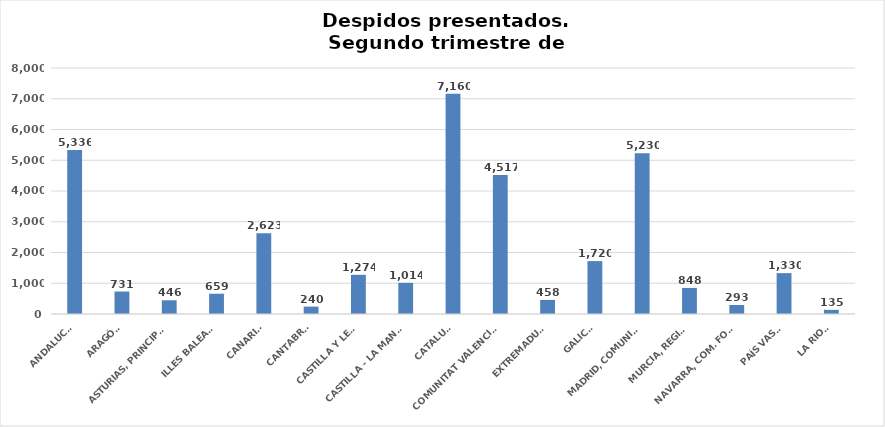
| Category | Series 0 |
|---|---|
| ANDALUCÍA | 5336 |
| ARAGÓN | 731 |
| ASTURIAS, PRINCIPADO | 446 |
| ILLES BALEARS | 659 |
| CANARIAS | 2623 |
| CANTABRIA | 240 |
| CASTILLA Y LEÓN | 1274 |
| CASTILLA - LA MANCHA | 1014 |
| CATALUÑA | 7160 |
| COMUNITAT VALENCIANA | 4517 |
| EXTREMADURA | 458 |
| GALICIA | 1720 |
| MADRID, COMUNIDAD | 5230 |
| MURCIA, REGIÓN | 848 |
| NAVARRA, COM. FORAL | 293 |
| PAÍS VASCO | 1330 |
| LA RIOJA | 135 |